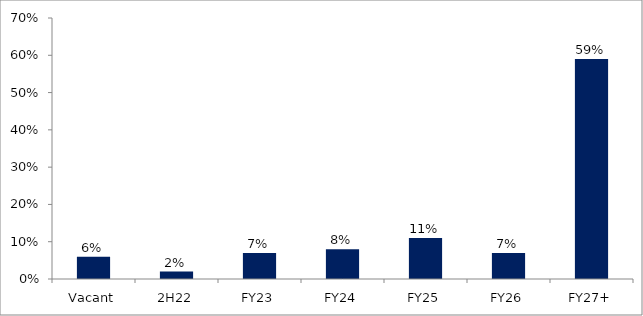
| Category | Series 0 |
|---|---|
| Vacant | 0.06 |
| 2H22 | 0.02 |
| FY23 | 0.07 |
| FY24 | 0.08 |
| FY25 | 0.11 |
| FY26 | 0.07 |
| FY27+ | 0.59 |